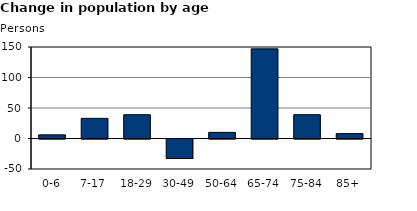
| Category | Series 2 |
|---|---|
| 0-6 | 6 |
| 7-17 | 33 |
| 18-29 | 39 |
| 30-49 | -32 |
| 50-64 | 10 |
| 65-74 | 147 |
| 75-84 | 39 |
| 85+ | 8 |